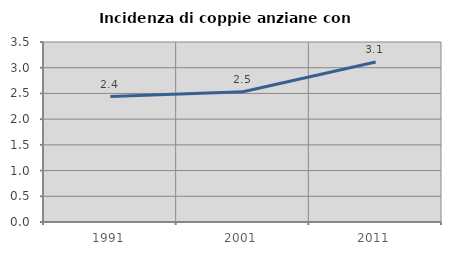
| Category | Incidenza di coppie anziane con figli |
|---|---|
| 1991.0 | 2.439 |
| 2001.0 | 2.532 |
| 2011.0 | 3.111 |